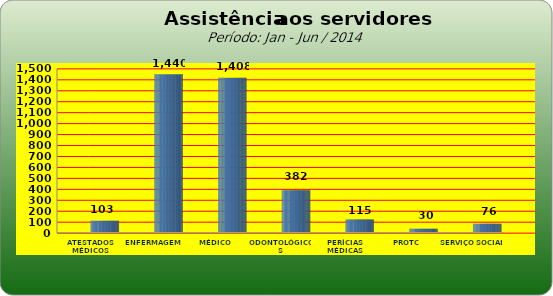
| Category | Series 0 |
|---|---|
| ATESTADOS MÉDICOS | 103 |
| ENFERMAGEM | 1440 |
| MÉDICO | 1408 |
| ODONTOLÓGICOS | 382 |
| PERÍCIAS MÉDICAS | 115 |
| PROTC | 30 |
| SERVIÇO SOCIAL | 76 |